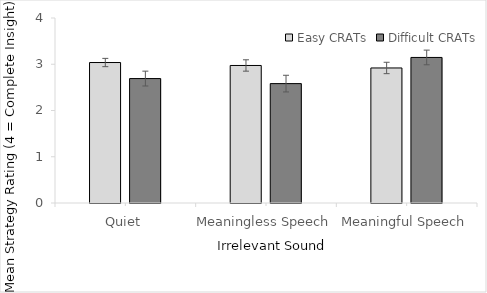
| Category | Easy CRATs | Difficult CRATs |
|---|---|---|
| Quiet | 3.037 | 2.69 |
| Meaningless Speech | 2.973 | 2.581 |
| Meaningful Speech | 2.92 | 3.147 |